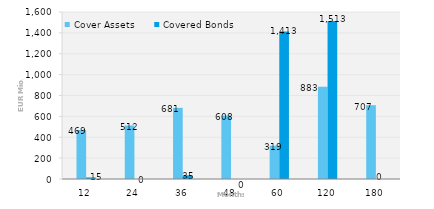
| Category | Cover Assets | Covered Bonds |
|---|---|---|
| 12.0 | 469.407 | 15 |
| 24.0 | 512.336 | 0 |
| 36.0 | 681.411 | 35 |
| 48.0 | 608.169 | 0 |
| 60.0 | 319.077 | 1413.034 |
| 120.0 | 883.343 | 1513 |
| 180.0 | 707.023 | 0 |